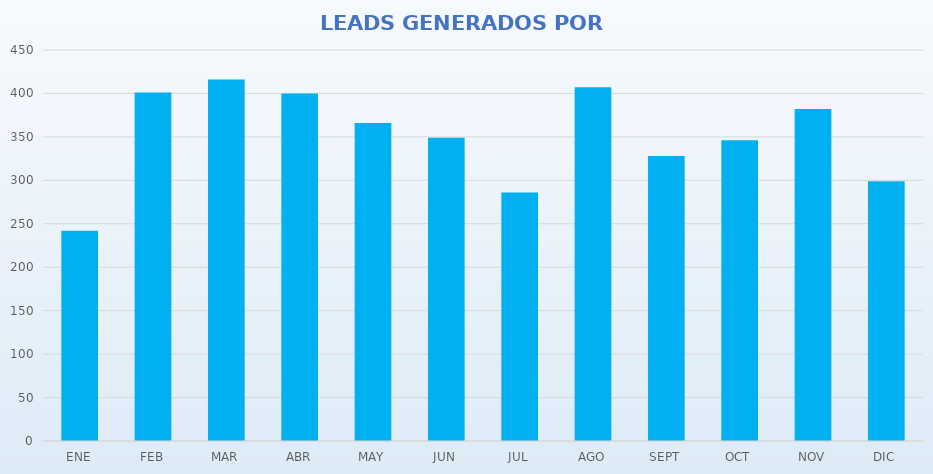
| Category | Series 0 |
|---|---|
| ENE | 242 |
| FEB | 401 |
| MAR | 416 |
| ABR | 400 |
| MAY | 366 |
| JUN | 349 |
| JUL | 286 |
| AGO | 407 |
| SEPT | 328 |
| OCT | 346 |
| NOV | 382 |
| DIC | 299 |